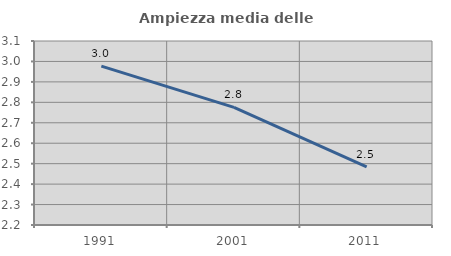
| Category | Ampiezza media delle famiglie |
|---|---|
| 1991.0 | 2.977 |
| 2001.0 | 2.775 |
| 2011.0 | 2.484 |